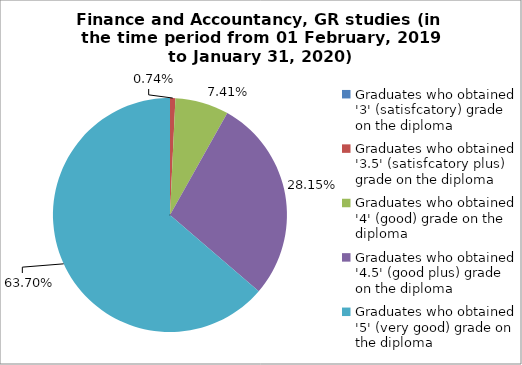
| Category | Series 1 |
|---|---|
| Graduates who obtained '3' (satisfcatory) grade on the diploma  | 0 |
| Graduates who obtained '3.5' (satisfcatory plus) grade on the diploma  | 0.741 |
| Graduates who obtained '4' (good) grade on the diploma  | 7.407 |
| Graduates who obtained '4.5' (good plus) grade on the diploma  | 28.148 |
| Graduates who obtained '5' (very good) grade on the diploma  | 63.704 |